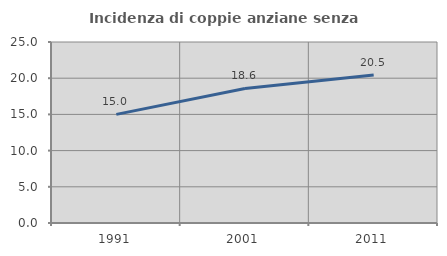
| Category | Incidenza di coppie anziane senza figli  |
|---|---|
| 1991.0 | 15 |
| 2001.0 | 18.584 |
| 2011.0 | 20.455 |